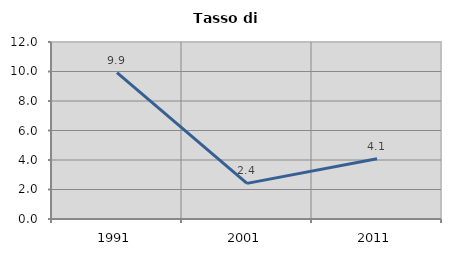
| Category | Tasso di disoccupazione   |
|---|---|
| 1991.0 | 9.922 |
| 2001.0 | 2.415 |
| 2011.0 | 4.079 |